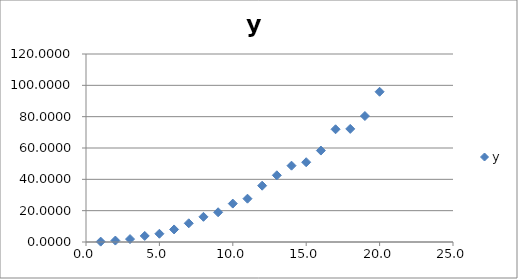
| Category | y |
|---|---|
| 1.0 | 0.233 |
| 2.0 | 0.915 |
| 3.0 | 1.872 |
| 4.0 | 3.875 |
| 5.0 | 5.265 |
| 6.0 | 8.012 |
| 7.0 | 11.947 |
| 8.0 | 16.072 |
| 9.0 | 18.987 |
| 10.0 | 24.516 |
| 11.0 | 27.637 |
| 12.0 | 35.947 |
| 13.0 | 42.572 |
| 14.0 | 48.716 |
| 15.0 | 50.922 |
| 16.0 | 58.367 |
| 17.0 | 71.95 |
| 18.0 | 72.192 |
| 19.0 | 80.412 |
| 20.0 | 95.895 |